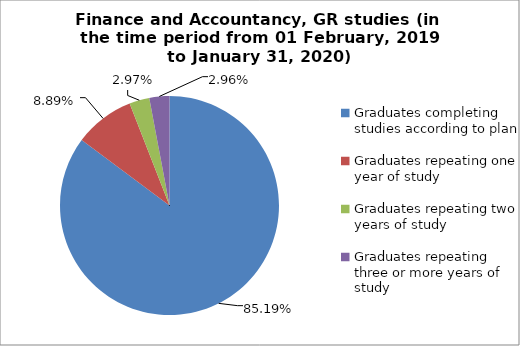
| Category | Series 0 |
|---|---|
| Graduates completing studies according to plan | 85.185 |
| Graduates repeating one year of study | 8.889 |
| Graduates repeating two years of study | 2.963 |
| Graduates repeating three or more years of study | 2.963 |